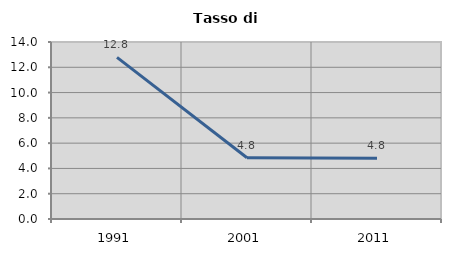
| Category | Tasso di disoccupazione   |
|---|---|
| 1991.0 | 12.784 |
| 2001.0 | 4.848 |
| 2011.0 | 4.805 |